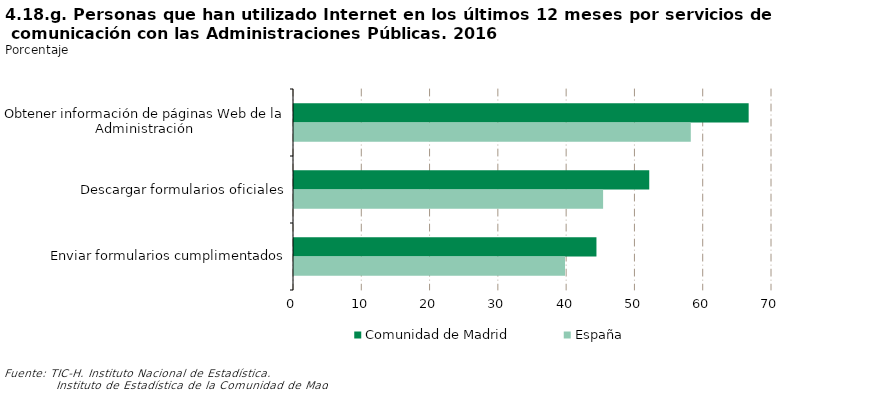
| Category | Comunidad de Madrid | España |
|---|---|---|
| Obtener información de páginas Web de la Administración | 66.582 | 58.107 |
| Descargar formularios oficiales | 52.023 | 45.266 |
| Enviar formularios cumplimentados | 44.292 | 39.689 |